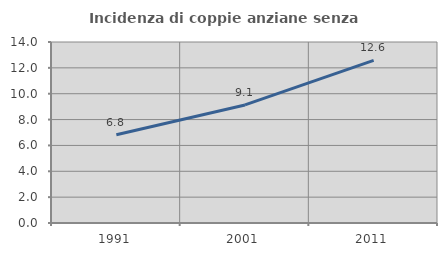
| Category | Incidenza di coppie anziane senza figli  |
|---|---|
| 1991.0 | 6.823 |
| 2001.0 | 9.133 |
| 2011.0 | 12.58 |